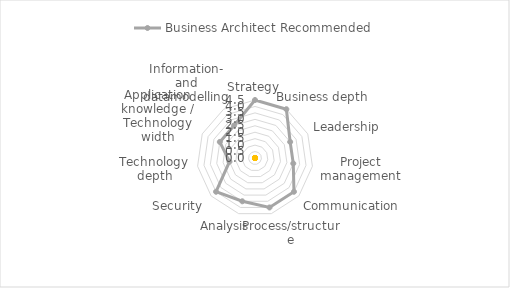
| Category | Business Architect |
|---|---|
| Strategy |  |
| Business depth |  |
| Leadership |  |
| Project management |  |
| Communication |  |
| Process/structure |  |
| Analysis |  |
| Security |  |
| Technology depth |  |
| Application knowledge / Technology width |  |
| Information- and datamodelling |  |